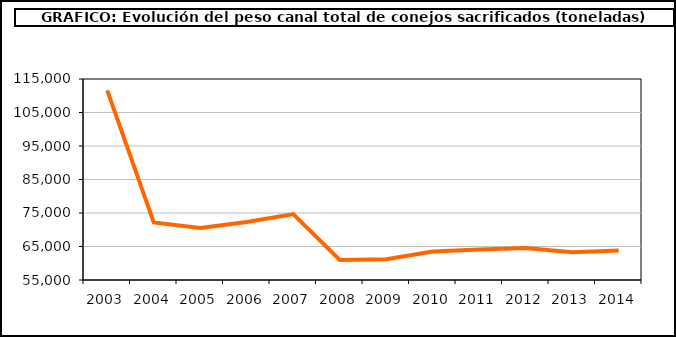
| Category | Peso canal |
|---|---|
| 2003.0 | 111582.524 |
| 2004.0 | 72158.367 |
| 2005.0 | 70523.95 |
| 2006.0 | 72307.553 |
| 2007.0 | 74666.407 |
| 2008.0 | 60960.313 |
| 2009.0 | 61195.132 |
| 2010.0 | 63505.334 |
| 2011.0 | 64139.488 |
| 2012.0 | 64578.018 |
| 2013.0 | 63288.914 |
| 2014.0 | 63789.699 |